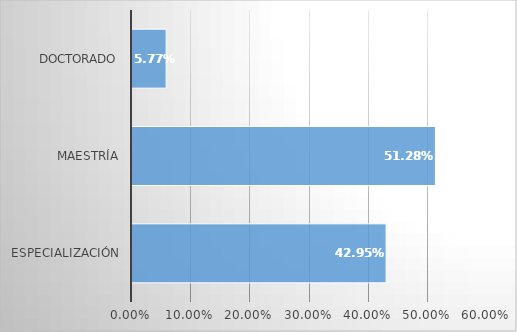
| Category | Series 0 |
|---|---|
| Especialización | 0.429 |
| Maestría | 0.513 |
| Doctorado | 0.058 |